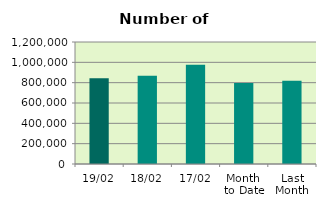
| Category | Series 0 |
|---|---|
| 19/02 | 844438 |
| 18/02 | 868594 |
| 17/02 | 976444 |
| Month 
to Date | 795702.533 |
| Last
Month | 819236.4 |